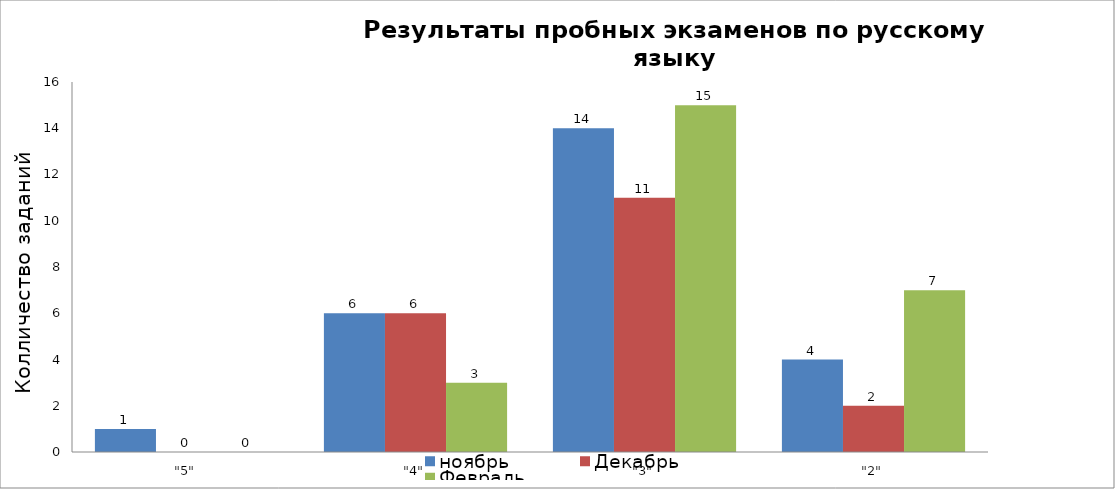
| Category | ноябрь | Декабрь | Февраль |
|---|---|---|---|
| "5" | 1 | 0 | 0 |
| "4" | 6 | 6 | 3 |
| "3" | 14 | 11 | 15 |
| "2" | 4 | 2 | 7 |